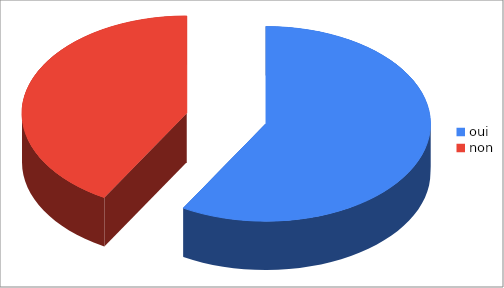
| Category | Series 0 |
|---|---|
| oui | 42 |
| non | 30 |